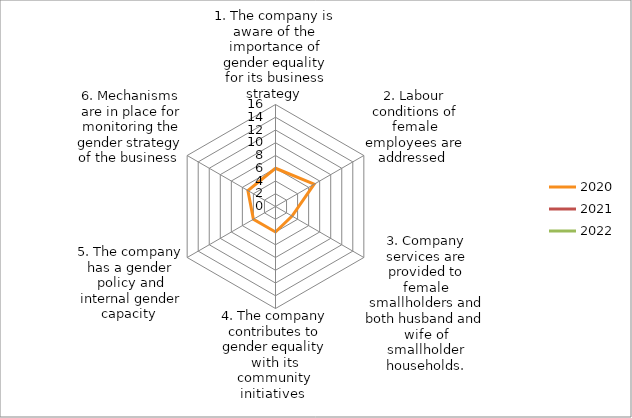
| Category | 2020 | 2021 | 2022 | 2023 |
|---|---|---|---|---|
| 1. The company is aware of the importance of gender equality for its business strategy  | 6 | 0 | 0 | 15 |
| 2. Labour conditions of female employees are addressed  | 7 | 0 | 0 | 0 |
| 3. Company services are provided to female smallholders and both husband and wife of smallholder households. | 3 | 0 | 0 | 0 |
| 4. The company contributes to gender equality with its community initiatives  | 4 | 0 | 0 | 0 |
| 5. The company has a gender policy and internal gender capacity  | 4 | 0 | 0 | 0 |
| 6. Mechanisms are in place for monitoring the gender strategy of the business  | 5 | 0 | 0 | 0 |